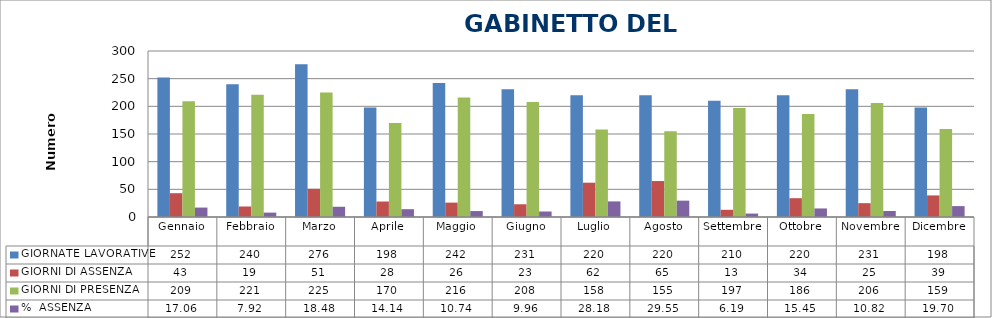
| Category | GIORNATE LAVORATIVE | GIORNI DI ASSENZA | GIORNI DI PRESENZA | %  ASSENZA |
|---|---|---|---|---|
| Gennaio | 252 | 43 | 209 | 17.063 |
| Febbraio | 240 | 19 | 221 | 7.917 |
| Marzo | 276 | 51 | 225 | 18.478 |
| Aprile | 198 | 28 | 170 | 14.141 |
| Maggio | 242 | 26 | 216 | 10.744 |
| Giugno | 231 | 23 | 208 | 9.957 |
| Luglio | 220 | 62 | 158 | 28.182 |
| Agosto | 220 | 65 | 155 | 29.545 |
| Settembre | 210 | 13 | 197 | 6.19 |
| Ottobre | 220 | 34 | 186 | 15.455 |
| Novembre | 231 | 25 | 206 | 10.823 |
| Dicembre | 198 | 39 | 159 | 19.697 |